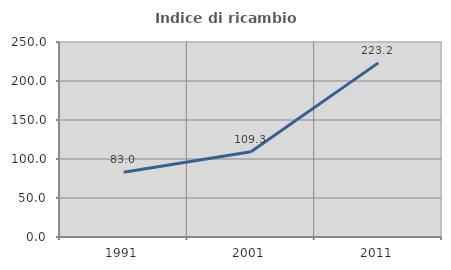
| Category | Indice di ricambio occupazionale  |
|---|---|
| 1991.0 | 83.012 |
| 2001.0 | 109.313 |
| 2011.0 | 223.241 |